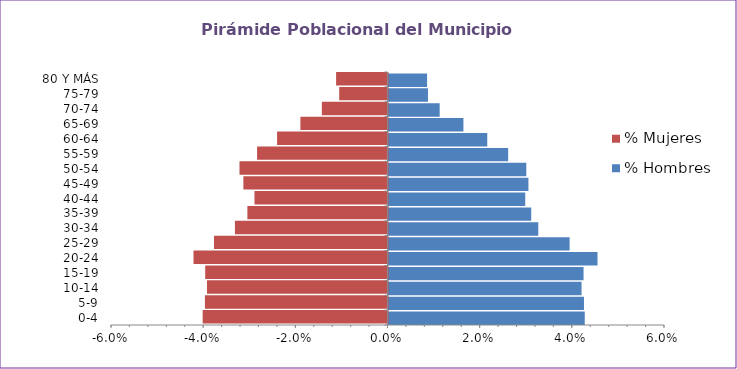
| Category | % Hombres | % Mujeres |
|---|---|---|
| 0-4 | 0.043 | -0.04 |
| 5-9 | 0.042 | -0.04 |
| 10-14 | 0.042 | -0.039 |
| 15-19 | 0.042 | -0.04 |
| 20-24 | 0.045 | -0.042 |
| 25-29 | 0.039 | -0.038 |
| 30-34 | 0.033 | -0.033 |
| 35-39 | 0.031 | -0.03 |
| 40-44 | 0.03 | -0.029 |
| 45-49 | 0.03 | -0.031 |
| 50-54 | 0.03 | -0.032 |
| 55-59 | 0.026 | -0.028 |
| 60-64 | 0.021 | -0.024 |
| 65-69 | 0.016 | -0.019 |
| 70-74 | 0.011 | -0.014 |
| 75-79 | 0.009 | -0.01 |
| 80 Y MÁS | 0.008 | -0.011 |